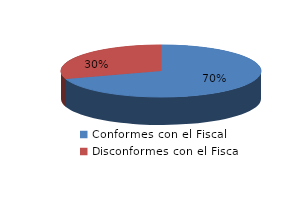
| Category | Series 0 |
|---|---|
| 0 | 2181 |
| 1 | 936 |